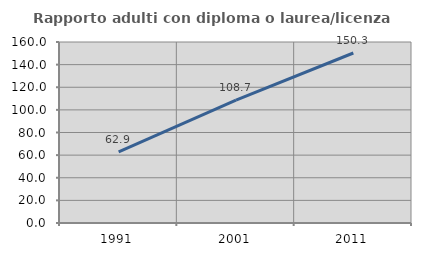
| Category | Rapporto adulti con diploma o laurea/licenza media  |
|---|---|
| 1991.0 | 62.879 |
| 2001.0 | 108.696 |
| 2011.0 | 150.289 |